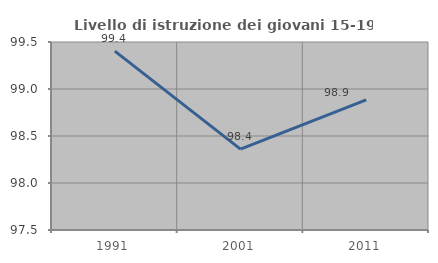
| Category | Livello di istruzione dei giovani 15-19 anni |
|---|---|
| 1991.0 | 99.404 |
| 2001.0 | 98.361 |
| 2011.0 | 98.884 |